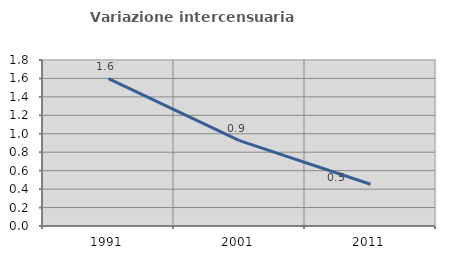
| Category | Variazione intercensuaria annua |
|---|---|
| 1991.0 | 1.599 |
| 2001.0 | 0.925 |
| 2011.0 | 0.453 |